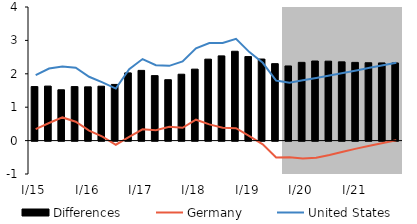
| Category | Differences |
|---|---|
| 0 | 1.618 |
| 1 | 1.632 |
| 2 | 1.522 |
| 3 | 1.617 |
| 4 | 1.61 |
| 5 | 1.629 |
| 6 | 1.682 |
| 7 | 2.027 |
| 8 | 2.102 |
| 9 | 1.946 |
| 10 | 1.823 |
| 11 | 1.988 |
| 12 | 2.14 |
| 13 | 2.439 |
| 14 | 2.536 |
| 15 | 2.675 |
| 16 | 2.516 |
| 17 | 2.442 |
| 18 | 2.304 |
| 19 | 2.235 |
| 20 | 2.343 |
| 21 | 2.383 |
| 22 | 2.378 |
| 23 | 2.358 |
| 24 | 2.342 |
| 25 | 2.331 |
| 26 | 2.326 |
| 27 | 2.325 |